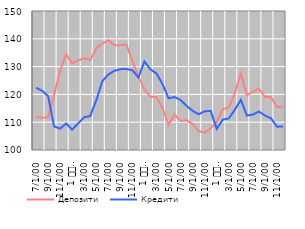
| Category | Депозити | Кредити |
|---|---|---|
| 7 | 111.964 | 122.373 |
| 8 | 111.568 | 121.324 |
| 9 | 111.754 | 119.428 |
| 10 | 119.818 | 108.496 |
| 11 | 128.451 | 107.689 |
| 12 | 134.383 | 109.526 |
| 1 
2010. | 131.121 | 107.342 |
| 2 | 132.266 | 109.58 |
| 3 | 132.99 | 111.79 |
| 4 | 132.344 | 112.213 |
| 5 | 136.598 | 117.828 |
| 6 | 138.239 | 124.738 |
| 7 | 139.51 | 127.138 |
| 8 | 137.691 | 128.478 |
| 9 | 137.71 | 129.082 |
| 10 | 137.918 | 129.149 |
| 11 | 131.993 | 128.714 |
| 12 | 126.308 | 126.096 |
| 1 
2011. | 121.901 | 131.847 |
| 2 | 119.046 | 128.989 |
| 3 | 119.035 | 127.523 |
| 4 | 115.079 | 123.723 |
| 5 | 109.057 | 118.616 |
| 6 | 112.781 | 119.041 |
| 7 | 110.467 | 117.972 |
| 8 | 110.68 | 115.863 |
| 9 | 109.37 | 114.087 |
| 10 | 106.749 | 112.84 |
| 11 | 106.316 | 113.908 |
| 12 | 107.862 | 114.083 |
| 1 
2012. | 110.055 | 107.629 |
| 2 | 114.639 | 110.941 |
| 3 | 115.37 | 111.347 |
| 4 | 120.347 | 114.471 |
| 5 | 127.565 | 118.064 |
| 6 | 119.712 | 112.398 |
| 7 | 120.992 | 112.755 |
| 8 | 122.05 | 113.833 |
| 9 | 119.104 | 112.422 |
| 10 | 119.074 | 111.413 |
| 11 | 115.439 | 108.388 |
| 12 | 115.609 | 108.478 |